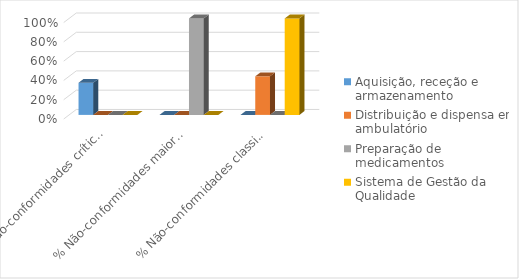
| Category | Aquisição, receção e armazenamento | Distribuição e dispensa em ambulatório | Preparação de medicamentos | Sistema de Gestão da Qualidade |
|---|---|---|---|---|
|  % Não-conformidades críticas com plano de ação em curso | 0.333 | 0 | 0 | 0 |
|  % Não-conformidades maiores com plano de ação em curso | 0 | 0 | 1 | 0 |
|  % Não-conformidades classificadas como outras com plano de ação em curso | 0 | 0.4 | 0 | 1 |